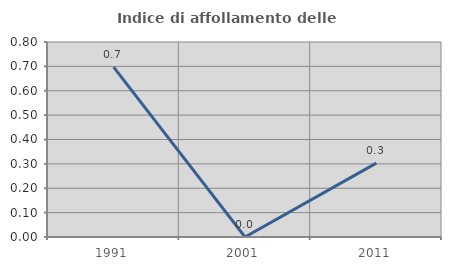
| Category | Indice di affollamento delle abitazioni  |
|---|---|
| 1991.0 | 0.697 |
| 2001.0 | 0 |
| 2011.0 | 0.303 |